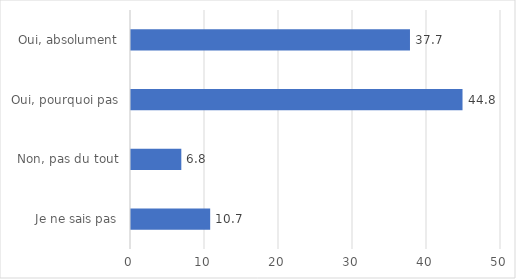
| Category | Series 0 |
|---|---|
| Je ne sais pas | 10.7 |
| Non, pas du tout | 6.8 |
| Oui, pourquoi pas | 44.8 |
| Oui, absolument | 37.7 |